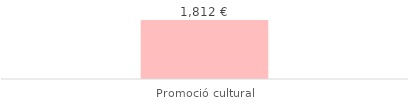
| Category | Total |
|---|---|
| Promoció cultural | 1811.8 |